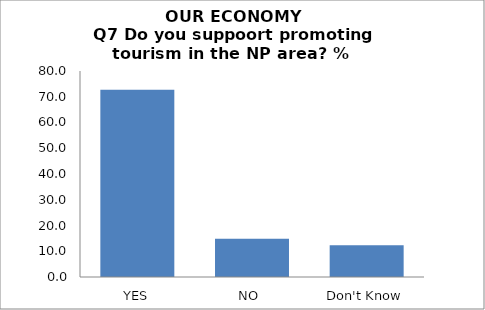
| Category | Series 0 |
|---|---|
| YES | 72.753 |
| NO  | 14.888 |
| Don't Know | 12.36 |